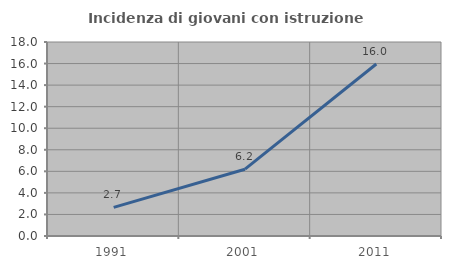
| Category | Incidenza di giovani con istruzione universitaria |
|---|---|
| 1991.0 | 2.653 |
| 2001.0 | 6.198 |
| 2011.0 | 15.957 |